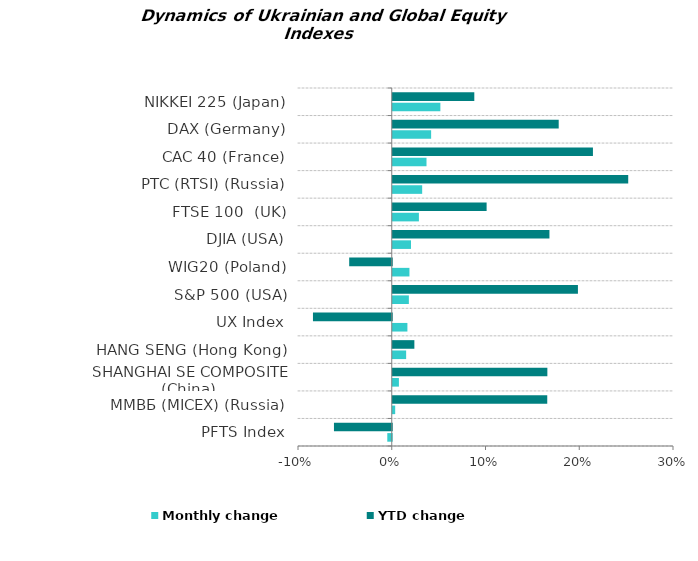
| Category | Monthly change | YTD change |
|---|---|---|
| PFTS Index | -0.005 | -0.062 |
| ММВБ (MICEX) (Russia) | 0.003 | 0.165 |
| SHANGHAI SE COMPOSITE (China) | 0.007 | 0.165 |
| HANG SENG (Hong Kong) | 0.014 | 0.023 |
| UX Index | 0.016 | -0.084 |
| S&P 500 (USA) | 0.017 | 0.198 |
| WIG20 (Poland) | 0.018 | -0.045 |
| DJIA (USA) | 0.019 | 0.167 |
| FTSE 100  (UK) | 0.028 | 0.1 |
| РТС (RTSI) (Russia) | 0.031 | 0.251 |
| CAC 40 (France) | 0.036 | 0.214 |
| DAX (Germany) | 0.041 | 0.177 |
| NIKKEI 225 (Japan) | 0.051 | 0.087 |